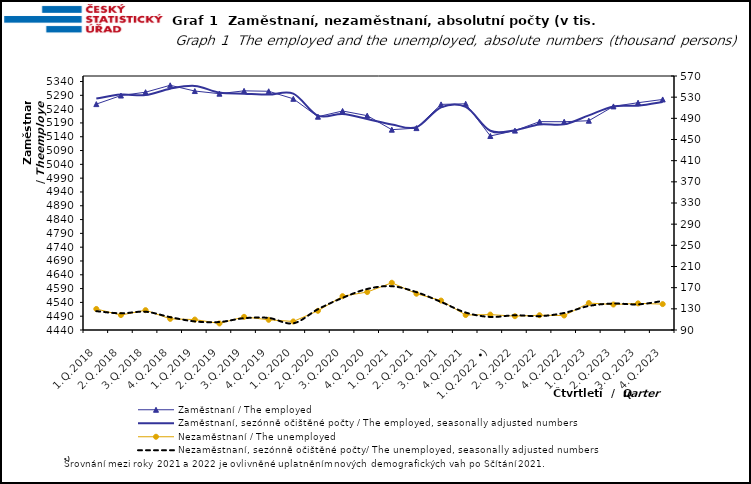
| Category | Zaměstnaní / The employed | Zaměstnaní, sezónně očištěné počty / The employed, seasonally adjusted numbers |
|---|---|---|
| 1.Q.2018 | 5258.225 | 5278.156 |
| 2.Q.2018 | 5289.242 | 5292.576 |
| 3.Q.2018 | 5301.361 | 5290.956 |
| 4.Q.2018 | 5326.327 | 5313.924 |
| 1.Q.2019 | 5305.534 | 5324.039 |
| 2.Q.2019 | 5295.929 | 5299.853 |
| 3.Q.2019 | 5306.247 | 5296.015 |
| 4.Q.2019 | 5304.7 | 5292.691 |
| 1.Q.2020 | 5277.418 | 5296.19 |
| 2.Q.2020 | 5212.593 | 5216.331 |
| 3.Q.2020 | 5233.335 | 5222.53 |
| 4.Q.2020 | 5216.403 | 5204.603 |
| 1.Q.2021 | 5165.582 | 5184.554 |
| 2.Q.2021 | 5171.264 | 5174.505 |
| 3.Q.2021 | 5257.199 | 5246.565 |
| 4.Q.2021 | 5259.43 | 5248.149 |
| 1.Q.2022 •) | 5142.708 | 5161.722 |
| 2.Q.2022 | 5162.167 | 5163.873 |
| 3.Q.2022 | 5194.696 | 5184.357 |
| 4.Q.2022 | 5194.353 | 5184.799 |
| 1.Q.2023 | 5198.026 | 5217.578 |
| 2.Q.2023 | 5249.908 | 5249.861 |
| 3.Q.2023 | 5263.267 | 5252.591 |
| 4.Q.2023 | 5275.091 | 5266.011 |